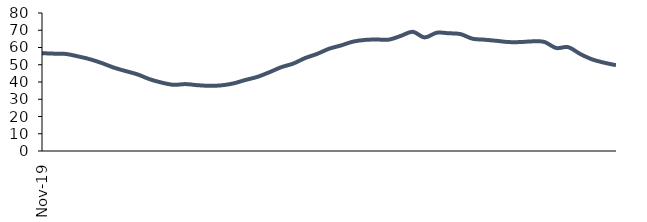
| Category | Series 0 |
|---|---|
| 2019-11-01 | 56.704 |
| 2019-12-01 | 56.434 |
| 2020-01-01 | 56.256 |
| 2020-02-01 | 54.873 |
| 2020-03-01 | 53.212 |
| 2020-04-01 | 50.982 |
| 2020-05-01 | 48.355 |
| 2020-06-01 | 46.331 |
| 2020-07-01 | 44.38 |
| 2020-08-01 | 41.619 |
| 2020-09-01 | 39.667 |
| 2020-10-01 | 38.362 |
| 2020-11-01 | 38.792 |
| 2020-12-01 | 38.145 |
| 2021-01-01 | 37.796 |
| 2021-02-01 | 38.055 |
| 2021-03-01 | 39.169 |
| 2021-04-01 | 41.169 |
| 2021-05-01 | 42.952 |
| 2021-06-01 | 45.61 |
| 2021-07-01 | 48.568 |
| 2021-08-01 | 50.651 |
| 2021-09-01 | 53.87 |
| 2021-10-01 | 56.277 |
| 2021-11-01 | 59.262 |
| 2021-12-01 | 61.182 |
| 2022-01-01 | 63.387 |
| 2022-02-01 | 64.392 |
| 2022-03-01 | 64.636 |
| 2022-04-01 | 64.553 |
| 2022-05-01 | 66.706 |
| 2022-06-01 | 69.09 |
| 2022-07-01 | 65.835 |
| 2022-08-01 | 68.552 |
| 2022-09-01 | 68.253 |
| 2022-10-01 | 67.758 |
| 2022-11-01 | 65.088 |
| 2022-12-01 | 64.531 |
| 2023-01-01 | 63.88 |
| 2023-02-01 | 63.159 |
| 2023-03-01 | 63.145 |
| 2023-04-01 | 63.558 |
| 2023-05-01 | 63.246 |
| 2023-06-01 | 59.697 |
| 2023-07-01 | 60.197 |
| 2023-08-01 | 56.277 |
| 2023-09-01 | 53.115 |
| 2023-10-01 | 51.209 |
| 2023-11-01 | 49.736 |